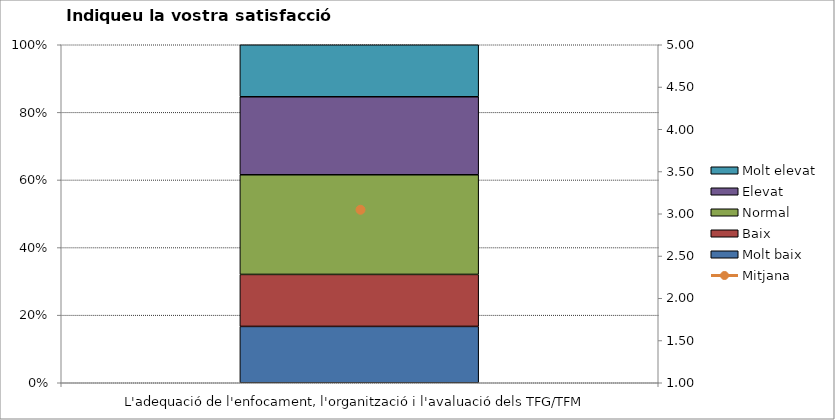
| Category | Molt baix | Baix | Normal  | Elevat | Molt elevat |
|---|---|---|---|---|---|
| L'adequació de l'enfocament, l'organització i l'avaluació dels TFG/TFM | 13 | 12 | 23 | 18 | 12 |